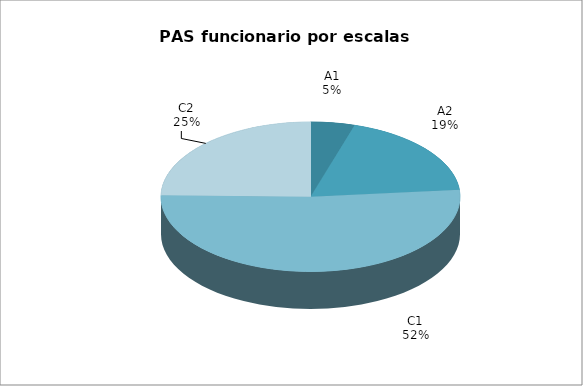
| Category | Series 0 |
|---|---|
| A1 | 20 |
| A2 | 79 |
| C1 | 218 |
| C2 | 104 |